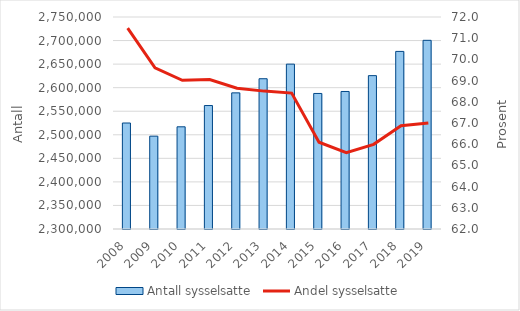
| Category | Antall sysselsatte |
|---|---|
| 2008.0 | 2524985 |
| 2009.0 | 2497067 |
| 2010.0 | 2516927 |
| 2011.0 | 2562066 |
| 2012.0 | 2588953 |
| 2013.0 | 2618971 |
| 2014.0 | 2649952 |
| 2015.0 | 2587690 |
| 2016.0 | 2591900 |
| 2017.0 | 2625553 |
| 2018.0 | 2676956 |
| 2019.0 | 2700491 |